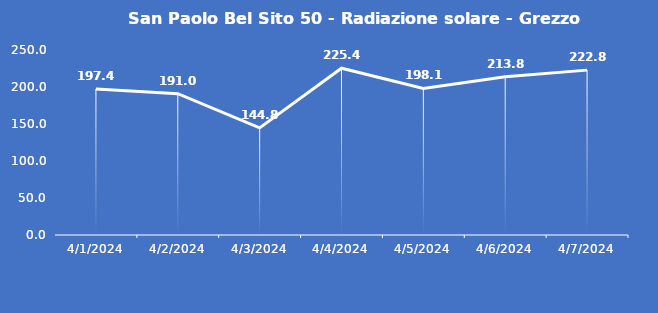
| Category | San Paolo Bel Sito 50 - Radiazione solare - Grezzo (W/m2) |
|---|---|
| 4/1/24 | 197.4 |
| 4/2/24 | 191 |
| 4/3/24 | 144.8 |
| 4/4/24 | 225.4 |
| 4/5/24 | 198.1 |
| 4/6/24 | 213.8 |
| 4/7/24 | 222.8 |